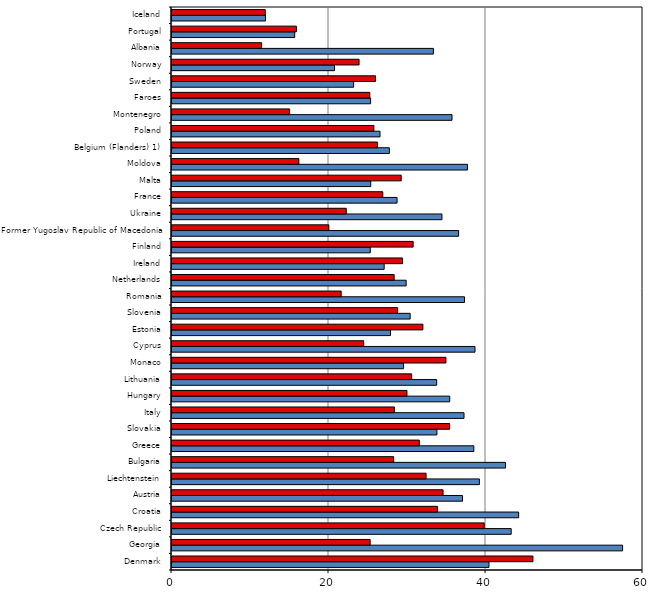
| Category | Boys | Girls |
|---|---|---|
| Denmark | 40.38 | 45.98 |
| Georgia | 57.4 | 25.24 |
| Czech Republic | 43.21 | 39.77 |
| Croatia | 44.16 | 33.82 |
| Austria | 37.01 | 34.53 |
| Liechtenstein | 39.16 | 32.37 |
| Bulgaria | 42.49 | 28.24 |
| Greece | 38.45 | 31.51 |
| Slovakia | 33.75 | 35.37 |
| Italy | 37.2 | 28.33 |
| Hungary | 35.38 | 29.93 |
| Lithuania | 33.72 | 30.53 |
| Monaco | 29.5 | 34.9 |
| Cyprus | 38.6 | 24.42 |
| Estonia | 27.84 | 31.96 |
| Slovenia | 30.34 | 28.74 |
| Romania | 37.26 | 21.55 |
| Netherlands | 29.83 | 28.3 |
| Ireland | 27.03 | 29.37 |
| Finland | 25.26 | 30.72 |
| Former Yugoslav Republic of Macedonia | 36.51 | 19.98 |
| Ukraine | 34.39 | 22.2 |
| France | 28.67 | 26.85 |
| Malta | 25.32 | 29.2 |
| Moldova | 37.64 | 16.16 |
| Belgium (Flanders) 1) | 27.69 | 26.18 |
| Poland | 26.5 | 25.72 |
| Montenegro | 35.67 | 14.98 |
| Faroes | 25.3 | 25.2 |
| Sweden | 23.14 | 25.92 |
| Norway | 20.7 | 23.83 |
| Albania | 33.3 | 11.41 |
| Portugal | 15.63 | 15.85 |
| Iceland | 11.91 | 11.88 |